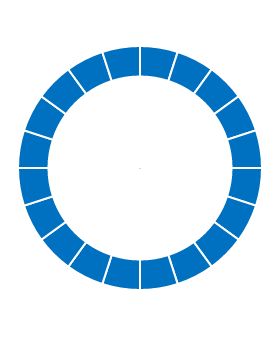
| Category | Series 1 |
|---|---|
| 0 | 0.85 |
| 1 | 0.15 |